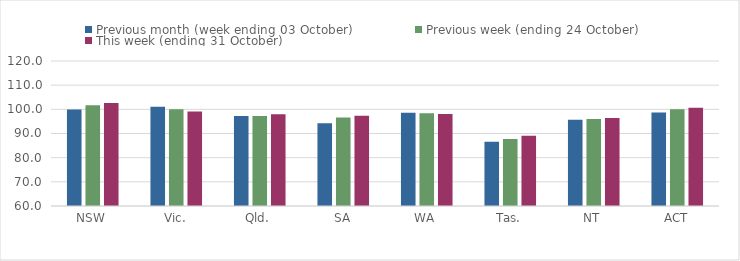
| Category | Previous month (week ending 03 October) | Previous week (ending 24 October) | This week (ending 31 October) |
|---|---|---|---|
| NSW | 99.94 | 101.67 | 102.63 |
| Vic. | 101.08 | 100.05 | 99.1 |
| Qld. | 97.24 | 97.29 | 97.97 |
| SA | 94.22 | 96.67 | 97.31 |
| WA | 98.57 | 98.42 | 98.02 |
| Tas. | 86.61 | 87.72 | 89.03 |
| NT | 95.7 | 95.96 | 96.37 |
| ACT | 98.7 | 100 | 100.68 |